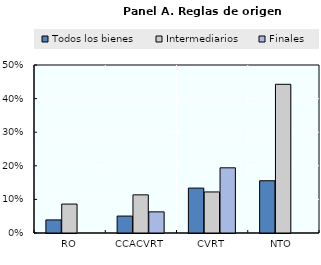
| Category | Todos los bienes | Intermediarios | Finales |
|---|---|---|---|
| RO | 0.039 | 0.086 | 0 |
| CCACVRT | 0.05 | 0.114 | 0.063 |
| CVRT | 0.134 | 0.122 | 0.194 |
| NTO | 0.155 | 0.443 | 0 |